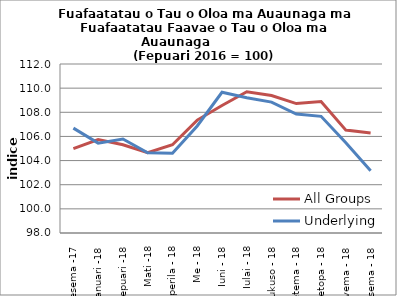
| Category | All Groups | Underlying |
|---|---|---|
| Tesema -17 | 104.983 | 106.688 |
| Ianuari -18 | 105.739 | 105.443 |
| Fepuari -18 | 105.308 | 105.79 |
| Mati -18 | 104.655 | 104.651 |
| Aperila - 18 | 105.309 | 104.614 |
| Me - 18 | 107.355 | 106.863 |
| Iuni - 18 | 108.567 | 109.659 |
| Iulai - 18 | 109.702 | 109.198 |
| Aukuso - 18 | 109.392 | 108.845 |
| Setema - 18 | 108.722 | 107.857 |
| Oketopa - 18 | 108.895 | 107.664 |
| Novema - 18 | 106.524 | 105.471 |
| Tesema - 18 | 106.292 | 103.148 |